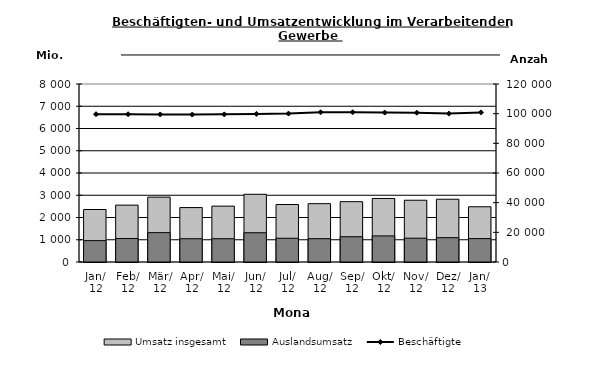
| Category | Umsatz insgesamt | Auslandsumsatz |
|---|---|---|
| 2012-01-01 | 2359.931 | 959.968 |
| 2012-02-01 | 2556.725 | 1054.383 |
| 2012-03-01 | 2915.913 | 1319.032 |
| 2012-04-01 | 2446.427 | 1044.941 |
| 2012-05-01 | 2511.664 | 1046.581 |
| 2012-06-01 | 3043.821 | 1314.446 |
| 2012-07-01 | 2583.605 | 1066.984 |
| 2012-08-01 | 2621.741 | 1047.425 |
| 2012-09-01 | 2712.074 | 1135.543 |
| 2012-10-01 | 2855.379 | 1172.066 |
| 2012-11-01 | 2775.413 | 1069.743 |
| 2012-12-01 | 2821.024 | 1093.843 |
| 2013-01-01 | 2482.358 | 1051.73 |